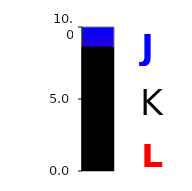
| Category | Series 0 |
|---|---|
| 0 | 8.603 |